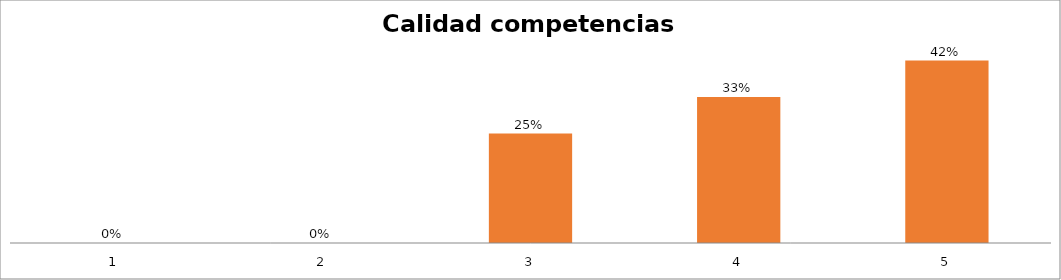
| Category | Series 1 |
|---|---|
| 0 | 0 |
| 1 | 0 |
| 2 | 0.25 |
| 3 | 0.333 |
| 4 | 0.417 |